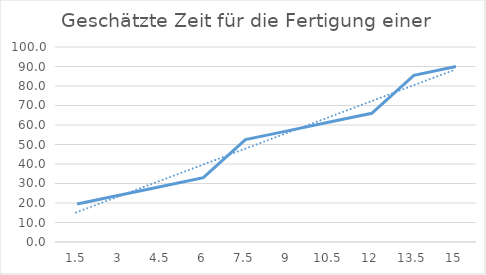
| Category | Gesamt Zeit |
|---|---|
| 1.5 | 19.5 |
| 3.0 | 24 |
| 4.5 | 28.5 |
| 6.0 | 33 |
| 7.5 | 52.5 |
| 9.0 | 57 |
| 10.5 | 61.5 |
| 12.0 | 66 |
| 13.5 | 85.5 |
| 15.0 | 90 |